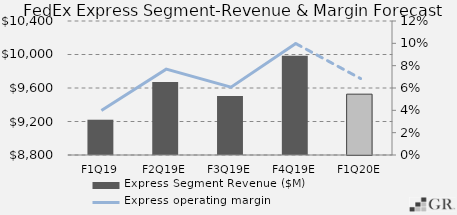
| Category | Express Segment Revenue ($M) |
|---|---|
|  F1Q19  | 9221.298 |
|  F2Q19E  | 9670.731 |
|  F3Q19E  | 9505.101 |
|  F4Q19E  | 9984.49 |
|  F1Q20E  | 9526.375 |